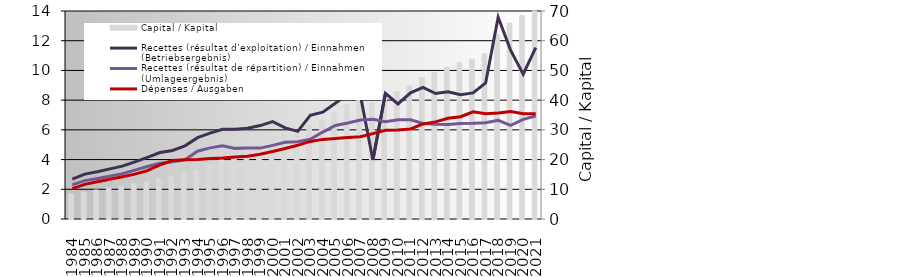
| Category | Capital / Kapital |
|---|---|
| 1984.0 | 8.463 |
| 1985.0 | 9.131 |
| 1986.0 | 9.765 |
| 1987.0 | 10.411 |
| 1988.0 | 11.053 |
| 1989.0 | 11.824 |
| 1990.0 | 12.553 |
| 1991.0 | 13.433 |
| 1992.0 | 14.228 |
| 1993.0 | 15.16 |
| 1994.0 | 16.509 |
| 1995.0 | 18.129 |
| 1996.0 | 19.946 |
| 1997.0 | 21.771 |
| 1998.0 | 23.514 |
| 1999.0 | 25.4 |
| 2000.0 | 27.322 |
| 2001.0 | 28.557 |
| 2002.0 | 29.562 |
| 2003.0 | 31.408 |
| 2004.0 | 33.313 |
| 2005.0 | 35.601 |
| 2006.0 | 38.386 |
| 2007.0 | 41.06 |
| 2008.0 | 39.002 |
| 2009.0 | 41.382 |
| 2010.0 | 42.817 |
| 2011.0 | 44.895 |
| 2012.0 | 47.62 |
| 2013.0 | 49.304 |
| 2014.0 | 51.025 |
| 2015.0 | 52.596 |
| 2016.0 | 53.683 |
| 2017.0 | 55.643 |
| 2018.0 | 62.085 |
| 2019.0 | 65.839 |
| 2020.0 | 68.477 |
| 2021.0 | 72.526 |